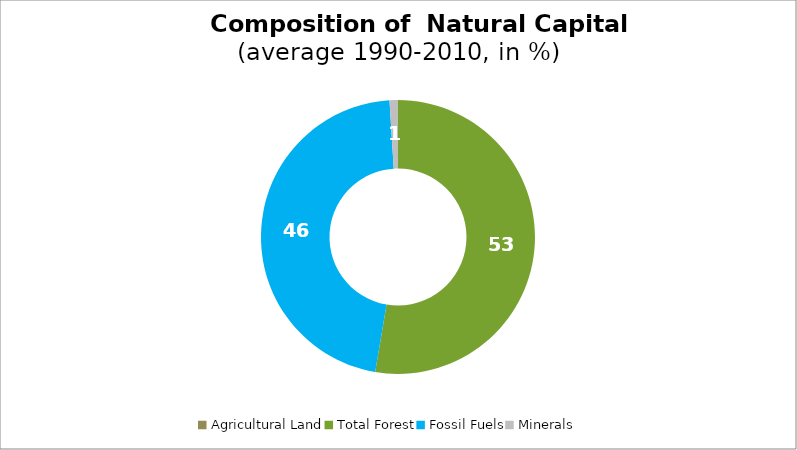
| Category | Series 0 |
|---|---|
| Agricultural Land | 0 |
| Total Forest | 52.668 |
| Fossil Fuels | 46.341 |
| Minerals | 0.991 |